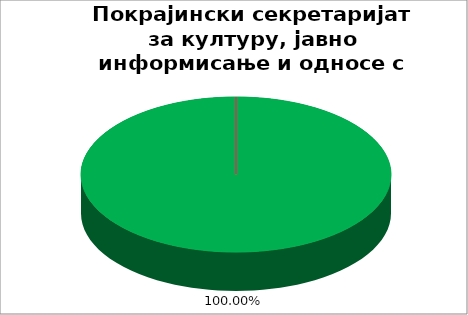
| Category | Покрајински секретаријат за културу, јавно информисање и односе с верским заједницама |
|---|---|
| 0 | 1 |
| 1 | 0 |
| 2 | 0 |
| 3 | 0 |
| 4 | 0 |